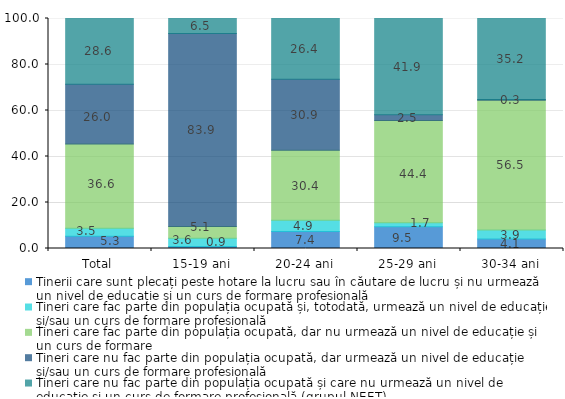
| Category | Tinerii care sunt plecați peste hotare la lucru sau în căutare de lucru și nu urmează un nivel de educație și un curs de formare profesională | Tineri care fac parte din populația ocupată și, totodată, urmează un nivel de educație și/sau un curs de formare profesională | Tineri care fac parte din populația ocupată, dar nu urmează un nivel de educație și un curs de formare | Tineri care nu fac parte din populația ocupată, dar urmează un nivel de educație și/sau un curs de formare profesională | Tineri care nu fac parte din populația ocupată și care nu urmează un nivel de educație și un curs de formare profesională (grupul NEET) |
|---|---|---|---|---|---|
| Total | 5.3 | 3.5 | 36.6 | 26 | 28.6 |
| 15-19 ani | 0.9 | 3.6 | 5.1 | 83.9 | 6.5 |
| 20-24 ani | 7.4 | 4.9 | 30.4 | 30.9 | 26.4 |
| 25-29 ani | 9.5 | 1.7 | 44.4 | 2.5 | 41.9 |
| 30-34 ani | 4.1 | 3.9 | 56.5 | 0.3 | 35.2 |